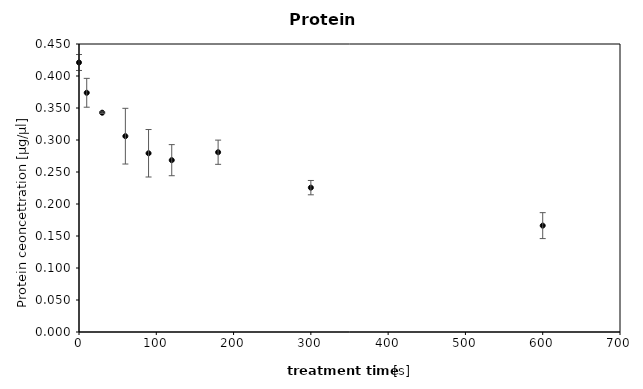
| Category | Series 0 |
|---|---|
| 0.0 | 0.421 |
| 10.0 | 0.374 |
| 30.0 | 0.343 |
| 60.0 | 0.306 |
| 90.0 | 0.279 |
| 120.0 | 0.268 |
| 180.0 | 0.281 |
| 300.0 | 0.226 |
| 600.0 | 0.166 |